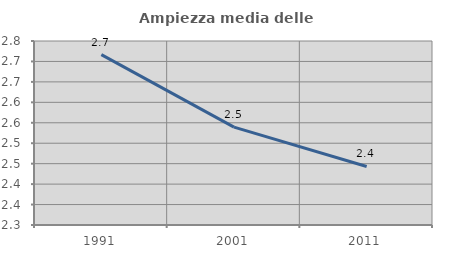
| Category | Ampiezza media delle famiglie |
|---|---|
| 1991.0 | 2.717 |
| 2001.0 | 2.539 |
| 2011.0 | 2.443 |